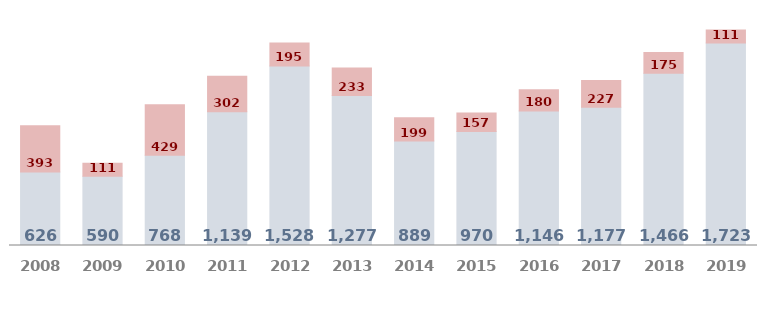
| Category | عمليات ضمان ائتمان الصادرات | عمليات ضمان الاستثمار |
|---|---|---|
| 2008.0 | 626.4 | 393.32 |
| 2009.0 | 589.62 | 111.25 |
| 2010.0 | 768.11 | 429.27 |
| 2011.0 | 1138.639 | 302.179 |
| 2012.0 | 1528.062 | 195.343 |
| 2013.0 | 1276.926 | 233.127 |
| 2014.0 | 888.95 | 198.63 |
| 2015.0 | 970.431 | 156.629 |
| 2016.0 | 1145.574 | 179.56 |
| 2017.0 | 1176.98 | 226.591 |
| 2018.0 | 1466.484 | 175.23 |
| 2019.0 | 1723.04 | 110.897 |